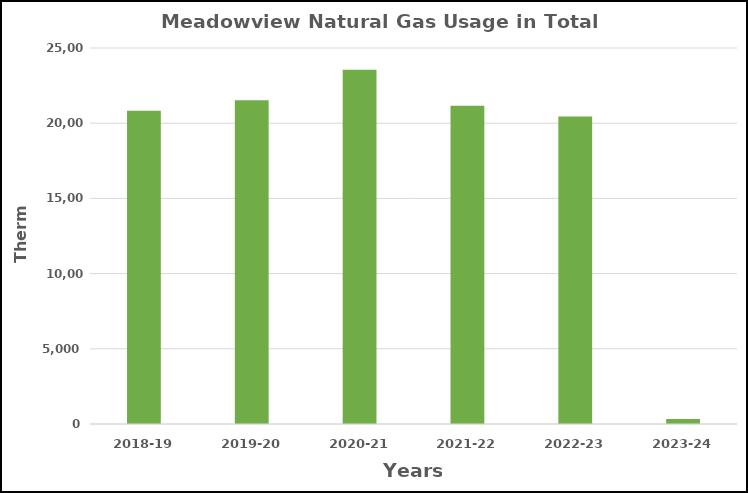
| Category | Series 0 |
|---|---|
| 2018-19 | 20824 |
| 2019-20 | 21534 |
| 2020-21 | 23549 |
| 2021-22 | 21155 |
| 2022-23 | 20446 |
| 2023-24 | 326 |